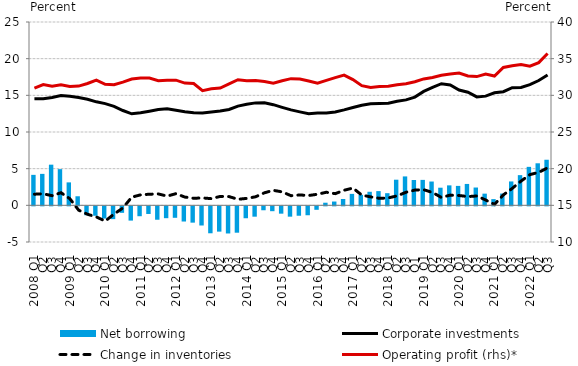
| Category | Net borrowing |
|---|---|
| 2008 Q1 | 4.156 |
| Q2 | 4.29 |
| Q3 | 5.545 |
| Q4 | 4.935 |
| 2009 Q1 | 3.13 |
| Q2 | 1.236 |
| Q3 | -1.214 |
| Q4 | -1.287 |
| 2010 Q1 | -1.668 |
| Q2 | -1.744 |
| Q3 | -0.885 |
| Q4 | -1.945 |
| 2011 Q1 | -1.349 |
| Q2 | -1.042 |
| Q3 | -1.828 |
| Q4 | -1.616 |
| 2012 Q1 | -1.564 |
| Q2 | -2.071 |
| Q3 | -2.225 |
| Q4 | -2.613 |
| 2013 Q1 | -3.675 |
| Q2 | -3.449 |
| Q3 | -3.702 |
| Q4 | -3.595 |
| 2014 Q1 | -1.624 |
| Q2 | -1.411 |
| Q3 | -0.536 |
| Q4 | -0.663 |
| 2015 Q1 | -1 |
| Q2 | -1.41 |
| Q3 | -1.283 |
| Q4 | -1.215 |
| 2016 Q1 | -0.473 |
| Q2 | 0.357 |
| Q3 | 0.519 |
| Q4 | 0.866 |
| 2017 Q1 | 1.562 |
| Q2 | 1.435 |
| Q3 | 1.848 |
| Q4 | 1.94 |
| 2018 Q1 | 1.657 |
| Q2 | 3.495 |
| Q3 | 3.943 |
| Q1 | 3.455 |
| 2019 Q1 | 3.47 |
| Q2 | 3.246 |
| Q3 | 2.404 |
| Q4 | 2.722 |
| 2020 Q1 | 2.65 |
| Q2 | 2.917 |
| Q3 | 2.429 |
| Q4 | 1.594 |
|  2021 Q1 | 0.847 |
| Q2 | 1.605 |
| Q3 | 3.257 |
| Q4 | 4.117 |
|  2022 Q1 | 5.247 |
| Q2 | 5.734 |
| Q3 | 6.217 |